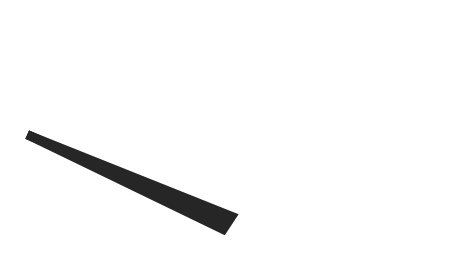
| Category | y |
|---|---|
| 5.995009656815462 | 23.739 |
| 50.94957744277862 | 1.76 |
| 49.05042255722138 | -1.76 |
| 5.995009656815462 | 23.739 |
| 50.0 | 0 |